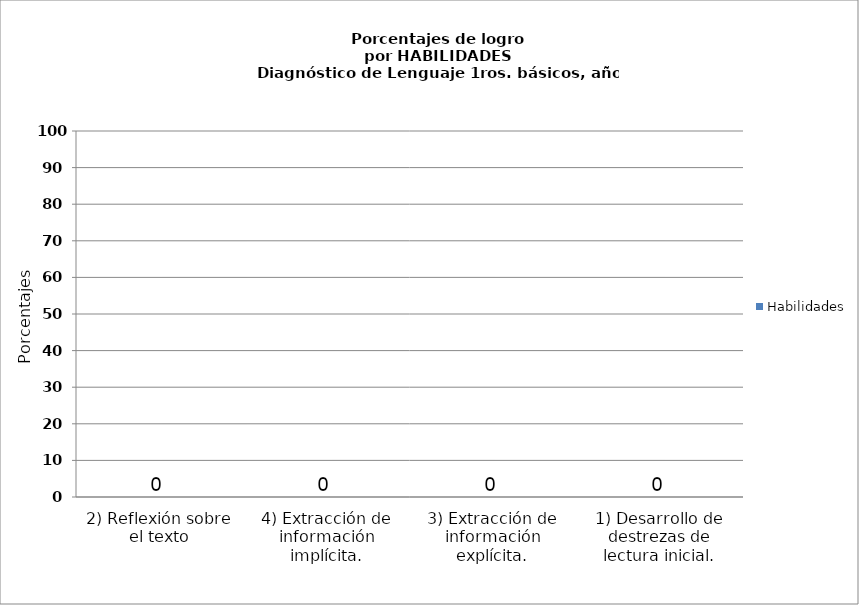
| Category | Habilidades |
|---|---|
| 2) Reflexión sobre el texto | 0 |
| 4) Extracción de información implícita. | 0 |
| 3) Extracción de información explícita. | 0 |
| 1) Desarrollo de destrezas de lectura inicial. | 0 |